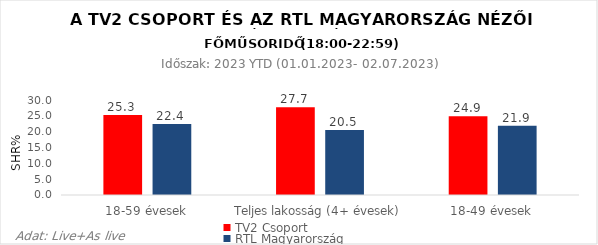
| Category | TV2 Csoport | RTL Magyarország |
|---|---|---|
| 18-59 évesek | 25.3 | 22.4 |
| Teljes lakosság (4+ évesek) | 27.7 | 20.5 |
| 18-49 évesek | 24.9 | 21.9 |